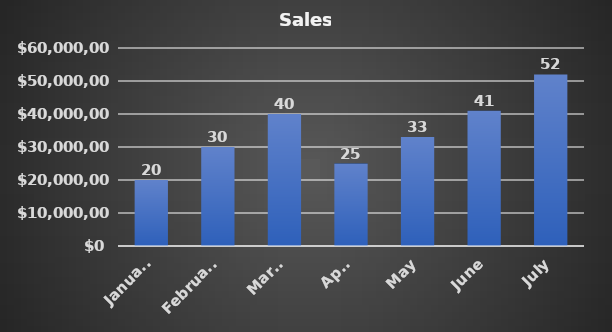
| Category | Sales |
|---|---|
| January | 20000000 |
| February | 30000000 |
| March | 40000000 |
| April | 25000000 |
| May | 33000000 |
| June | 41000000 |
| July | 52000000 |